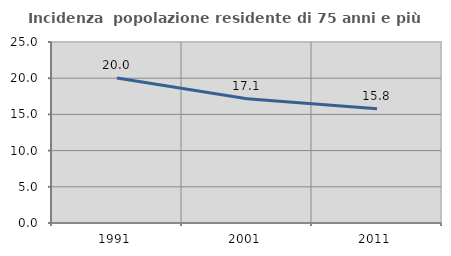
| Category | Incidenza  popolazione residente di 75 anni e più |
|---|---|
| 1991.0 | 20.028 |
| 2001.0 | 17.147 |
| 2011.0 | 15.774 |